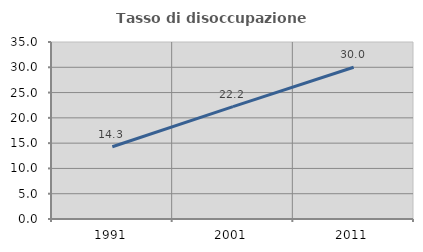
| Category | Tasso di disoccupazione giovanile  |
|---|---|
| 1991.0 | 14.286 |
| 2001.0 | 22.222 |
| 2011.0 | 30 |